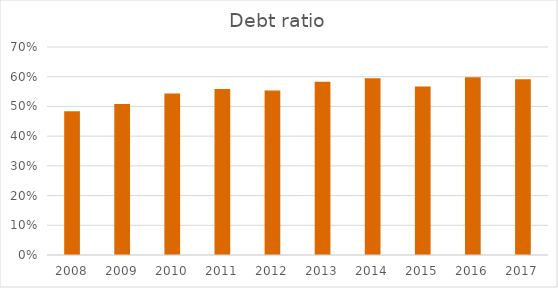
| Category | Debt ratio |
|---|---|
| 2008.0 | 0.484 |
| 2009.0 | 0.508 |
| 2010.0 | 0.544 |
| 2011.0 | 0.559 |
| 2012.0 | 0.554 |
| 2013.0 | 0.583 |
| 2014.0 | 0.595 |
| 2015.0 | 0.567 |
| 2016.0 | 0.598 |
| 2017.0 | 0.592 |